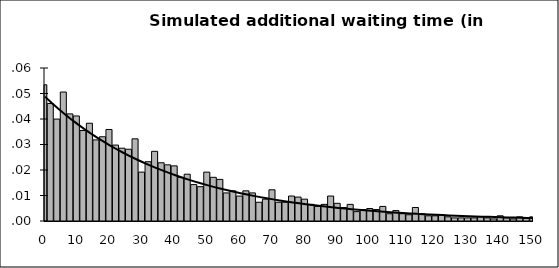
| Category | Series 1 |
|---|---|
| 0.0 | 0.053 |
| 2.0 | 0.046 |
| 4.0 | 0.04 |
| 6.0 | 0.051 |
| 8.0 | 0.042 |
| 10.0 | 0.041 |
| 12.0 | 0.035 |
| 14.0 | 0.038 |
| 16.0 | 0.032 |
| 18.0 | 0.033 |
| 20.0 | 0.036 |
| 22.0 | 0.03 |
| 24.0 | 0.029 |
| 26.0 | 0.028 |
| 28.0 | 0.032 |
| 30.0 | 0.019 |
| 32.0 | 0.023 |
| 34.0 | 0.027 |
| 36.0 | 0.023 |
| 38.0 | 0.022 |
| 40.0 | 0.022 |
| 42.0 | 0.017 |
| 44.0 | 0.018 |
| 46.0 | 0.014 |
| 48.0 | 0.013 |
| 50.0 | 0.019 |
| 52.0 | 0.017 |
| 54.0 | 0.016 |
| 56.0 | 0.011 |
| 58.0 | 0.012 |
| 60.0 | 0.01 |
| 62.0 | 0.012 |
| 64.0 | 0.011 |
| 66.0 | 0.007 |
| 68.0 | 0.009 |
| 70.0 | 0.012 |
| 72.0 | 0.007 |
| 74.0 | 0.007 |
| 76.0 | 0.01 |
| 78.0 | 0.009 |
| 80.0 | 0.009 |
| 82.0 | 0.007 |
| 84.0 | 0.006 |
| 86.0 | 0.007 |
| 88.0 | 0.01 |
| 90.0 | 0.007 |
| 92.0 | 0.005 |
| 94.0 | 0.007 |
| 96.0 | 0.004 |
| 98.0 | 0.004 |
| 100.0 | 0.005 |
| 102.0 | 0.004 |
| 104.0 | 0.006 |
| 106.0 | 0.003 |
| 108.0 | 0.004 |
| 110.0 | 0.003 |
| 112.0 | 0.002 |
| 114.0 | 0.005 |
| 116.0 | 0.003 |
| 118.0 | 0.002 |
| 120.0 | 0.002 |
| 122.0 | 0.002 |
| 124.0 | 0.002 |
| 126.0 | 0.001 |
| 128.0 | 0.001 |
| 130.0 | 0.001 |
| 132.0 | 0.001 |
| 134.0 | 0.002 |
| 136.0 | 0.001 |
| 138.0 | 0.001 |
| 140.0 | 0.002 |
| 142.0 | 0.001 |
| 144.0 | 0.001 |
| 146.0 | 0.002 |
| 148.0 | 0.001 |
| 150.0 | 0.002 |